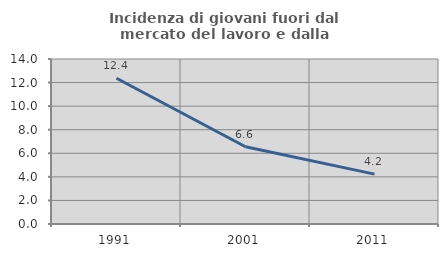
| Category | Incidenza di giovani fuori dal mercato del lavoro e dalla formazione  |
|---|---|
| 1991.0 | 12.365 |
| 2001.0 | 6.551 |
| 2011.0 | 4.23 |